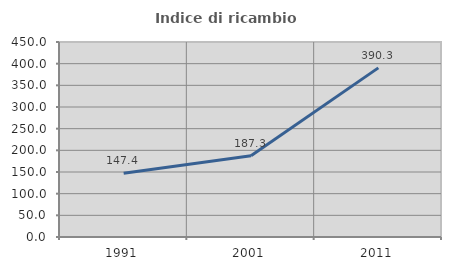
| Category | Indice di ricambio occupazionale  |
|---|---|
| 1991.0 | 147.368 |
| 2001.0 | 187.313 |
| 2011.0 | 390.291 |